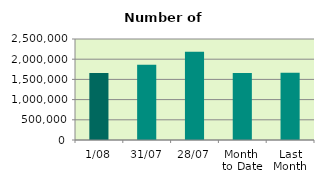
| Category | Series 0 |
|---|---|
| 1/08 | 1661280 |
| 31/07 | 1863114 |
| 28/07 | 2183496 |
| Month 
to Date | 1661280 |
| Last
Month | 1667155.905 |